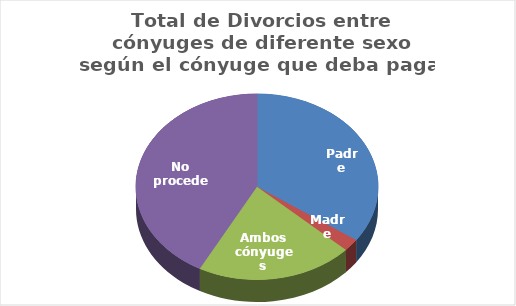
| Category | Series 0 |
|---|---|
| Padre | 29582 |
| Madre | 1861 |
| Ambos cónyuges | 17801 |
| No procede | 35935 |